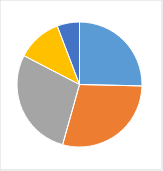
| Category | Series 0 |
|---|---|
| 0 | 0.254 |
| 1 | 0.29 |
| 2 | 0.283 |
| 3 | 0.116 |
| 4 | 0.058 |